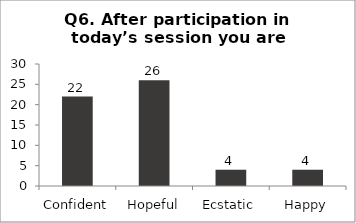
| Category | Q6. After participation in today’s session you are feeling? |
|---|---|
| Confident | 22 |
| Hopeful | 26 |
| Ecstatic | 4 |
| Happy | 4 |